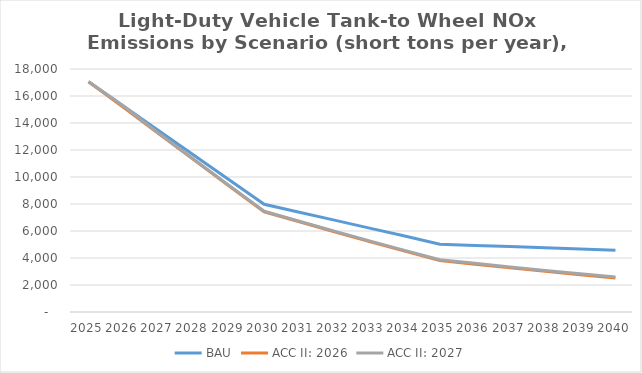
| Category | BAU | ACC II: 2026 | ACC II: 2027 |
|---|---|---|---|
| 2025.0 | 17050.08 | 17050.08 | 17050.08 |
| 2026.0 | 15236.856 | 15141.781 | 15236.856 |
| 2027.0 | 13428.331 | 13208.558 | 13224.484 |
| 2028.0 | 11616.495 | 11274.106 | 11298.185 |
| 2029.0 | 9799.473 | 9335.358 | 9366.993 |
| 2030.0 | 7975.624 | 7422.172 | 7458.53 |
| 2031.0 | 7390.757 | 6681.184 | 6725.808 |
| 2032.0 | 6803.32 | 5941.075 | 5992.704 |
| 2033.0 | 6214.341 | 5214.671 | 5271.28 |
| 2034.0 | 5623.888 | 4507.227 | 4566.61 |
| 2035.0 | 5014.111 | 3812.985 | 3872.548 |
| 2036.0 | 4932.187 | 3538.981 | 3602.95 |
| 2037.0 | 4846.831 | 3271.426 | 3337.935 |
| 2038.0 | 4757.562 | 3010.938 | 3078.271 |
| 2039.0 | 4665.314 | 2759.099 | 2824.866 |
| 2040.0 | 4568.107 | 2522.504 | 2584.127 |